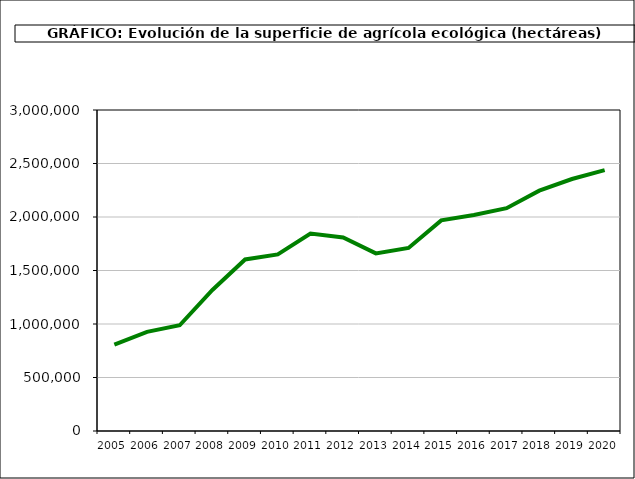
| Category | Superficie (ha) |
|---|---|
| 2005.0 | 807569 |
| 2006.0 | 926390 |
| 2007.0 | 988323 |
| 2008.0 | 1317752 |
| 2009.0 | 1602868 |
| 2010.0 | 1650866 |
| 2011.0 | 1845039 |
| 2012.0 | 1808492 |
| 2013.0 | 1659916 |
| 2014.0 | 1710493 |
| 2015.0 | 1968570 |
| 2016.0 | 2018802 |
| 2017.0 | 2082173 |
| 2018.0 | 2246475 |
| 2019.0 | 2354915.714 |
| 2020.0 | 2437891.017 |